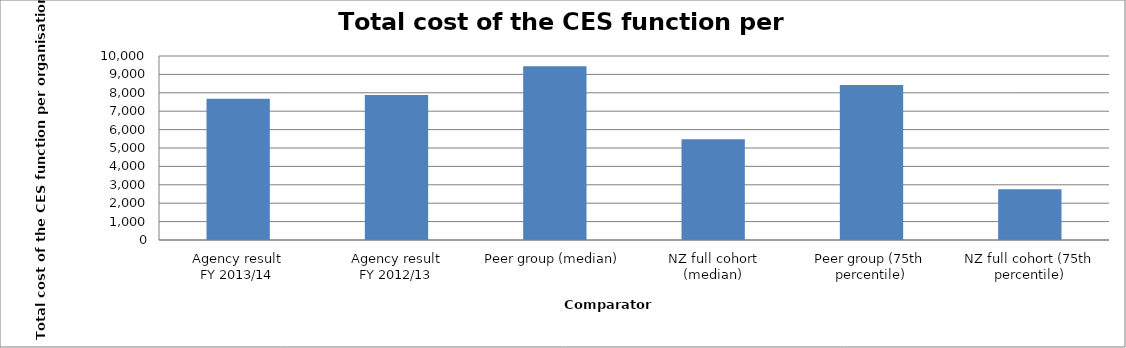
| Category | Result |
|---|---|
| Agency result
FY 2013/14 | 7669.914 |
| Agency result
FY 2012/13 | 7886.744 |
| Peer group (median) | 9446.298 |
| NZ full cohort (median) | 5473.881 |
| Peer group (75th percentile) | 8422.3 |
| NZ full cohort (75th percentile) | 2756.214 |